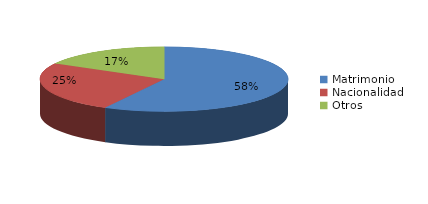
| Category | Series 0 |
|---|---|
| Matrimonio | 2759 |
| Nacionalidad | 1202 |
| Otros | 810 |